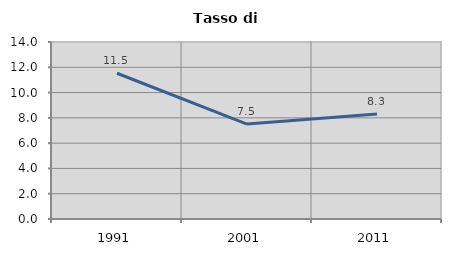
| Category | Tasso di disoccupazione   |
|---|---|
| 1991.0 | 11.53 |
| 2001.0 | 7.512 |
| 2011.0 | 8.303 |